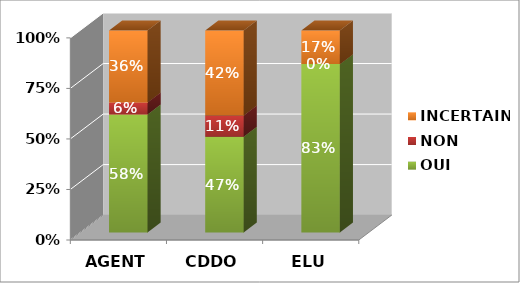
| Category | OUI | NON | INCERTAIN |
|---|---|---|---|
| AGENT | 0.584 | 0.059 | 0.356 |
| CDDO | 0.474 | 0.105 | 0.421 |
| ELU | 0.833 | 0 | 0.167 |